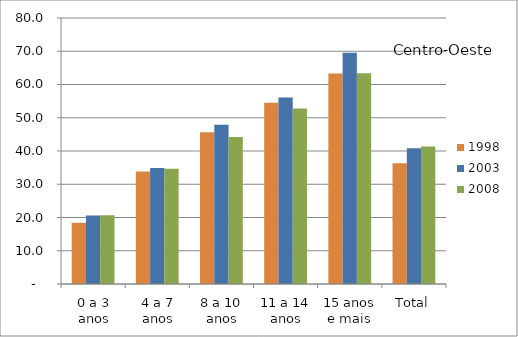
| Category | 1998 | 2003 | 2008 |
|---|---|---|---|
| 0 a 3 anos | 18.41 | 20.58 | 20.68 |
| 4 a 7 anos | 33.85 | 34.85 | 34.67 |
| 8 a 10 anos | 45.61 | 47.89 | 44.23 |
| 11 a 14 anos | 54.49 | 56.1 | 52.79 |
| 15 anos e mais | 63.34 | 69.56 | 63.38 |
| Total | 36.3 | 40.82 | 41.35 |